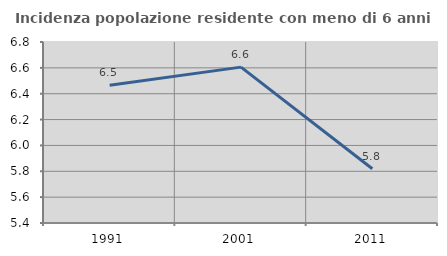
| Category | Incidenza popolazione residente con meno di 6 anni |
|---|---|
| 1991.0 | 6.465 |
| 2001.0 | 6.606 |
| 2011.0 | 5.82 |